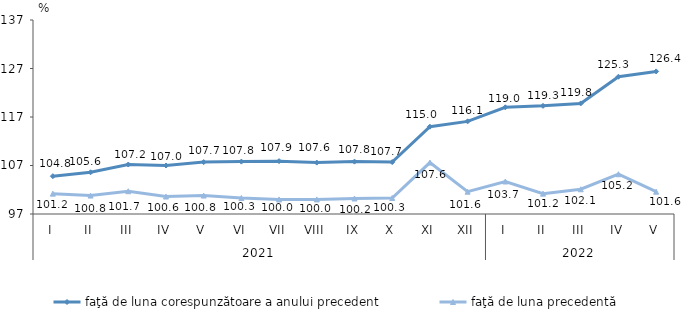
| Category | faţă de luna corespunzătoare a anului precedent | faţă de luna precedentă   |
|---|---|---|
| 0 | 104.8 | 101.2 |
| 1 | 105.6 | 100.8 |
| 2 | 107.2 | 101.7 |
| 3 | 107 | 100.6 |
| 4 | 107.7 | 100.8 |
| 5 | 107.8 | 100.3 |
| 6 | 107.9 | 100 |
| 7 | 107.6 | 100 |
| 8 | 107.8 | 100.2 |
| 9 | 107.7 | 100.3 |
| 10 | 115 | 107.6 |
| 11 | 116.1 | 101.6 |
| 12 | 119 | 103.7 |
| 13 | 119.3 | 101.2 |
| 14 | 119.8 | 102.1 |
| 15 | 125.3 | 105.2 |
| 16 | 126.4 | 101.6 |